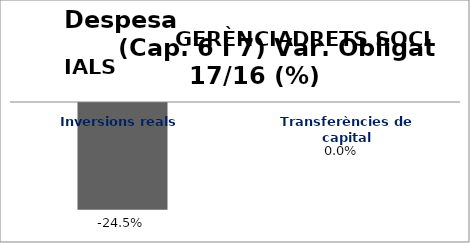
| Category | Series 0 |
|---|---|
| Inversions reals | -0.245 |
| Transferències de capital | 0 |